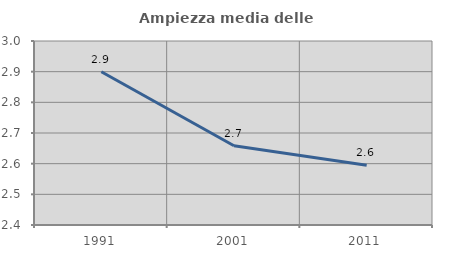
| Category | Ampiezza media delle famiglie |
|---|---|
| 1991.0 | 2.9 |
| 2001.0 | 2.659 |
| 2011.0 | 2.595 |